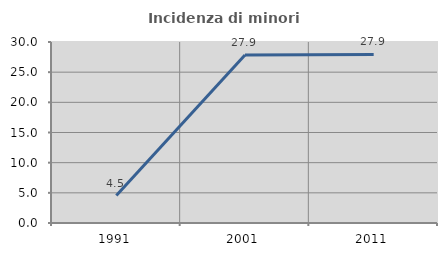
| Category | Incidenza di minori stranieri |
|---|---|
| 1991.0 | 4.545 |
| 2001.0 | 27.861 |
| 2011.0 | 27.941 |